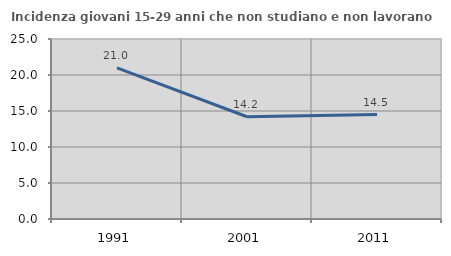
| Category | Incidenza giovani 15-29 anni che non studiano e non lavorano  |
|---|---|
| 1991.0 | 21 |
| 2001.0 | 14.199 |
| 2011.0 | 14.498 |